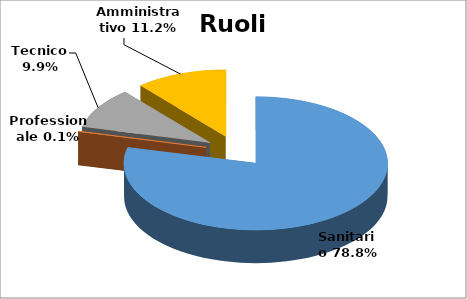
| Category | Series 0 |
|---|---|
| Sanitario | 0.788 |
| Professionale | 0.001 |
| Tecnico | 0.099 |
| Amministrativo | 0.112 |